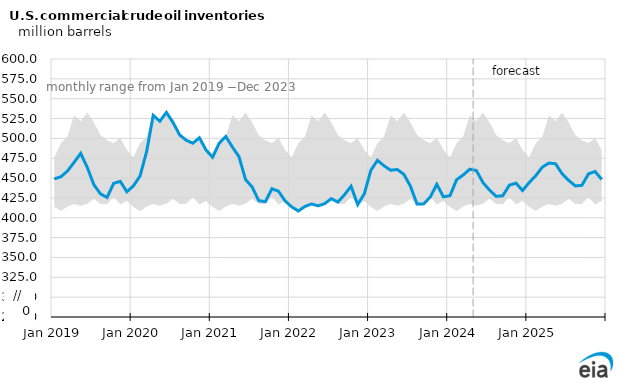
| Category | OECD commercial crude oil stocks |
|---|---|
| 2019-01-01 | 448.972 |
| 2019-02-01 | 451.66 |
| 2019-03-01 | 458.89 |
| 2019-04-01 | 469.802 |
| 2019-05-01 | 481.125 |
| 2019-06-01 | 463.446 |
| 2019-07-01 | 441.588 |
| 2019-08-01 | 430.118 |
| 2019-09-01 | 425.614 |
| 2019-10-01 | 443.367 |
| 2019-11-01 | 445.887 |
| 2019-12-01 | 432.772 |
| 2020-01-01 | 440.253 |
| 2020-02-01 | 452.563 |
| 2020-03-01 | 483.341 |
| 2020-04-01 | 529.035 |
| 2020-05-01 | 521.593 |
| 2020-06-01 | 532.657 |
| 2020-07-01 | 520.124 |
| 2020-08-01 | 504.399 |
| 2020-09-01 | 497.724 |
| 2020-10-01 | 493.922 |
| 2020-11-01 | 500.752 |
| 2020-12-01 | 485.471 |
| 2021-01-01 | 476.269 |
| 2021-02-01 | 493.876 |
| 2021-03-01 | 502.464 |
| 2021-04-01 | 489.158 |
| 2021-05-01 | 476.98 |
| 2021-06-01 | 448.108 |
| 2021-07-01 | 438.745 |
| 2021-08-01 | 421.525 |
| 2021-09-01 | 420.343 |
| 2021-10-01 | 436.58 |
| 2021-11-01 | 433.387 |
| 2021-12-01 | 421.184 |
| 2022-01-01 | 413.714 |
| 2022-02-01 | 408.526 |
| 2022-03-01 | 414.207 |
| 2022-04-01 | 417.382 |
| 2022-05-01 | 415.065 |
| 2022-06-01 | 417.799 |
| 2022-07-01 | 424.075 |
| 2022-08-01 | 419.785 |
| 2022-09-01 | 429 |
| 2022-10-01 | 439.678 |
| 2022-11-01 | 416.621 |
| 2022-12-01 | 430.102 |
| 2023-01-01 | 459.807 |
| 2023-02-01 | 472.357 |
| 2023-03-01 | 465.437 |
| 2023-04-01 | 459.882 |
| 2023-05-01 | 460.82 |
| 2023-06-01 | 454.734 |
| 2023-07-01 | 439.786 |
| 2023-08-01 | 417.299 |
| 2023-09-01 | 417.465 |
| 2023-10-01 | 426.067 |
| 2023-11-01 | 442.136 |
| 2023-12-01 | 426.388 |
| 2024-01-01 | 427.857 |
| 2024-02-01 | 447.929 |
| 2024-03-01 | 453.92 |
| 2024-04-01 | 461.206 |
| 2024-05-01 | 459.462 |
| 2024-06-01 | 444.266 |
| 2024-07-01 | 434.784 |
| 2024-08-01 | 427.003 |
| 2024-09-01 | 427.723 |
| 2024-10-01 | 441.051 |
| 2024-11-01 | 443.604 |
| 2024-12-01 | 434.286 |
| 2025-01-01 | 444.34 |
| 2025-02-01 | 453.048 |
| 2025-03-01 | 463.804 |
| 2025-04-01 | 468.937 |
| 2025-05-01 | 467.985 |
| 2025-06-01 | 455.459 |
| 2025-07-01 | 447.059 |
| 2025-08-01 | 440.122 |
| 2025-09-01 | 440.868 |
| 2025-10-01 | 455.355 |
| 2025-11-01 | 458.289 |
| 2025-12-01 | 448.184 |